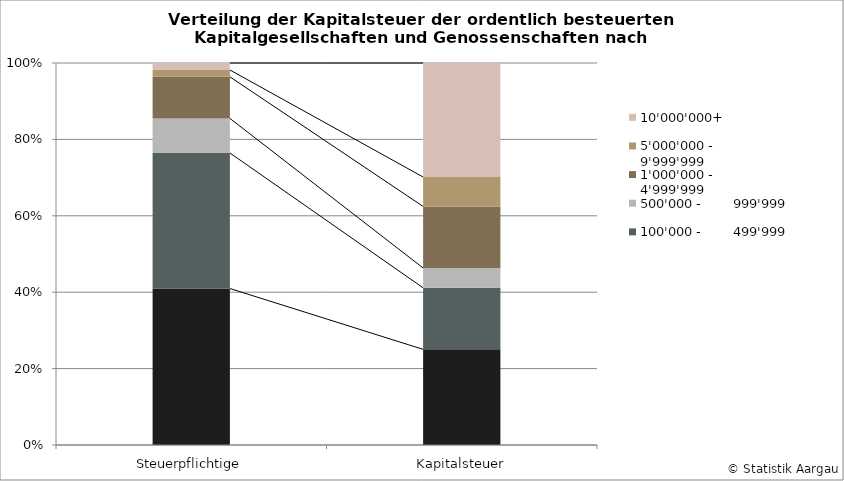
| Category | 0 -                     99'999 | 100'000 -        499'999 | 500'000 -        999'999 | 1'000'000 -     4'999'999 | 5'000'000 -     9'999'999 | 10'000'000+ |
|---|---|---|---|---|---|---|
| Steuerpflichtige | 40.968 | 35.481 | 9.05 | 10.883 | 1.793 | 1.824 |
| Kapitalsteuer | 25.034 | 16.109 | 5.203 | 16.113 | 7.699 | 29.843 |